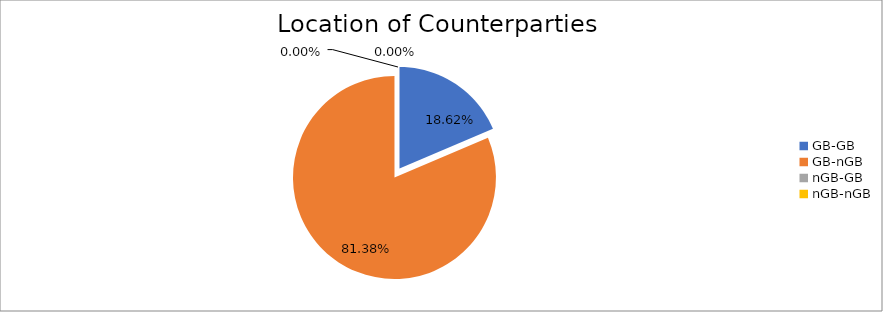
| Category | Series 0 |
|---|---|
| GB-GB | 1813970.311 |
| GB-nGB | 7929475.596 |
| nGB-GB | 286.58 |
| nGB-nGB | 95.74 |